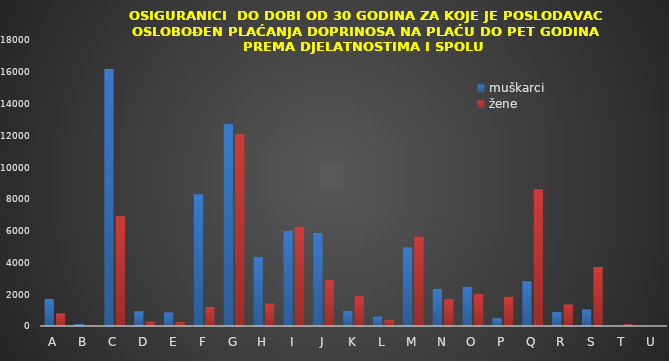
| Category | muškarci | žene |
|---|---|---|
| A | 1703 | 790 |
| B | 127 | 18 |
| C | 16177 | 6904 |
| D | 933 | 282 |
| E | 857 | 254 |
| F | 8294 | 1207 |
| G | 12709 | 12063 |
| H | 4331 | 1416 |
| I | 6002 | 6251 |
| J | 5856 | 2892 |
| K | 958 | 1877 |
| L | 593 | 392 |
| M | 4948 | 5632 |
| N | 2342 | 1681 |
| O | 2476 | 2009 |
| P | 489 | 1851 |
| Q | 2814 | 8599 |
| R | 874 | 1354 |
| S | 1041 | 3718 |
| T | 21 | 113 |
| U | 3 | 5 |